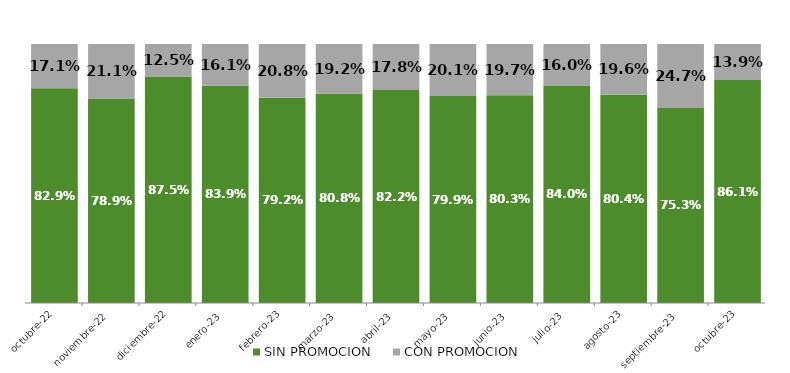
| Category | SIN PROMOCION   | CON PROMOCION   |
|---|---|---|
| 2022-10-01 | 0.829 | 0.171 |
| 2022-11-01 | 0.789 | 0.211 |
| 2022-12-01 | 0.875 | 0.125 |
| 2023-01-01 | 0.839 | 0.161 |
| 2023-02-01 | 0.792 | 0.208 |
| 2023-03-01 | 0.808 | 0.192 |
| 2023-04-01 | 0.822 | 0.178 |
| 2023-05-01 | 0.799 | 0.201 |
| 2023-06-01 | 0.803 | 0.197 |
| 2023-07-01 | 0.84 | 0.16 |
| 2023-08-01 | 0.804 | 0.196 |
| 2023-09-01 | 0.753 | 0.247 |
| 2023-10-01 | 0.861 | 0.139 |